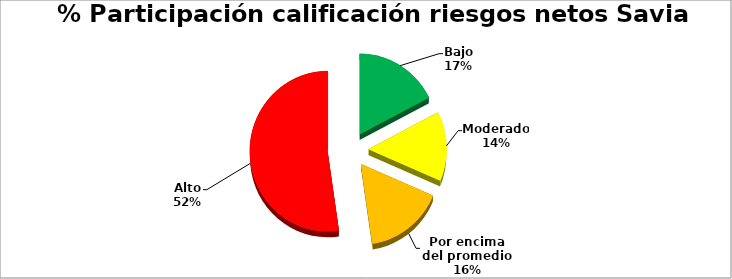
| Category | Series 0 |
|---|---|
| Bajo | 0.174 |
| Moderado  | 0.14 |
| Por encima del promedio | 0.163 |
| Alto | 0.523 |